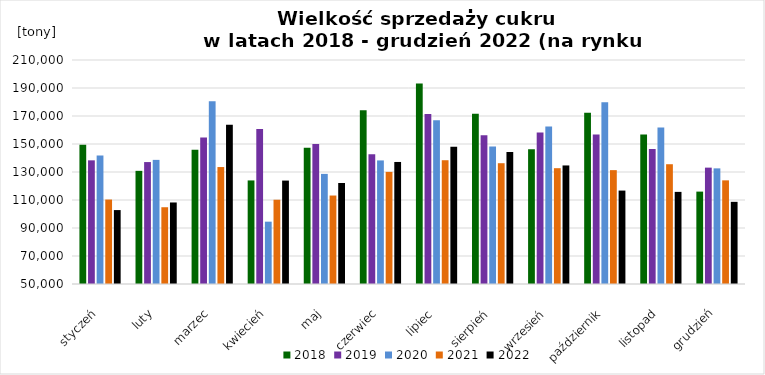
| Category | 2018 | 2019 | 2020 | 2021 | 2022 |
|---|---|---|---|---|---|
| styczeń | 149394.09 | 138330.31 | 141767.42 | 110331.21 | 102800.31 |
| luty | 130822.53 | 137095.49 | 138656.7 | 104835.03 | 108233.08 |
| marzec | 145863.79 | 154647.44 | 180503.53 | 133538.12 | 163750.38 |
| kwiecień | 123979.52 | 160722.77 | 94521.89 | 110198.71 | 123873 |
| maj | 147269.63 | 149962.12 | 128649.9 | 113196.52 | 122142.13 |
| czerwiec | 174058.88 | 142617.98 | 138269.79 | 130080.48 | 137170.01 |
| lipiec | 193169.88 | 171364.62 | 166919 | 138412.45 | 148043.75 |
| sierpień | 171663.7 | 156211.56 | 148210.3 | 136277.82 | 144319.17 |
| wrzesień | 146323.5 | 158226.28 | 162524.88 | 132720.8 | 134679.02 |
| październik | 172295.67 | 156804.33 | 179757.04 | 131333.61 | 116729.78 |
| listopad | 156790.45 | 146432.58 | 161724.7 | 135553.82 | 115801.66 |
| grudzień | 115997.05 | 133122.03 | 132594.64 | 124038.22 | 108694.43 |